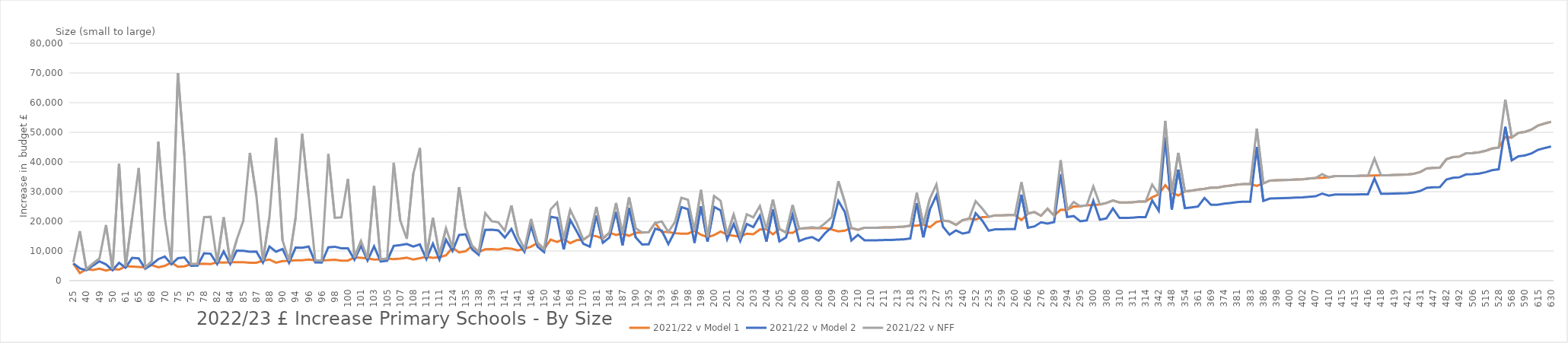
| Category | 2021/22 v Model 1 | 2021/22 v Model 2 | 2021/22 v NFF |
|---|---|---|---|
| 25.0 | 5811.593 | 5811.593 | 6213.718 |
| 36.0 | 2563.496 | 4150.422 | 16686.432 |
| 40.0 | 3883.133 | 3494.82 | 3883.133 |
| 45.0 | 3620.882 | 5048.206 | 5772.031 |
| 49.0 | 4023.598 | 6514.396 | 7490.063 |
| 49.0 | 3388.697 | 5486.462 | 18753.392 |
| 50.0 | 3915.221 | 3523.699 | 3915.221 |
| 58.0 | 3724.253 | 6029.742 | 39380.049 |
| 61.0 | 4846.749 | 4362.074 | 4846.749 |
| 61.0 | 4756.389 | 7700.821 | 21126.243 |
| 65.0 | 4639.358 | 7511.341 | 37982.715 |
| 65.0 | 4466.756 | 4020.081 | 4466.756 |
| 68.0 | 5244.518 | 5467.265 | 6561.045 |
| 69.0 | 4478.212 | 7250.439 | 46841.517 |
| 70.0 | 5007.302 | 8107.06 | 21109.706 |
| 73.0 | 6093.62 | 5484.258 | 6093.62 |
| 75.0 | 4688.474 | 7590.863 | 69994.969 |
| 75.0 | 4813.345 | 7793.035 | 41885.122 |
| 75.0 | 5576.842 | 5019.158 | 5576.842 |
| 77.0 | 5652.697 | 5087.428 | 5652.697 |
| 78.0 | 5689.828 | 9212.102 | 21407.631 |
| 78.0 | 5606.118 | 9076.572 | 21503.58 |
| 82.0 | 6177.833 | 5560.05 | 6177.833 |
| 83.0 | 6080.951 | 9845.349 | 21348.437 |
| 84.0 | 6224.773 | 5602.296 | 6224.773 |
| 85.0 | 6235.876 | 10096.18 | 13820.519 |
| 85.0 | 6215.303 | 10062.872 | 20174.98 |
| 86.0 | 6006.645 | 9725.044 | 43053.493 |
| 87.0 | 6055.256 | 9803.747 | 28607.131 |
| 88.0 | 6732.889 | 6059.6 | 6732.889 |
| 88.0 | 7116.099 | 11521.303 | 21495.438 |
| 89.0 | 6033.309 | 9768.214 | 48157.246 |
| 90.0 | 6593.15 | 10674.624 | 13577.74 |
| 91.0 | 6666.078 | 5999.47 | 6666.078 |
| 94.0 | 6881.127 | 11140.872 | 21239.34 |
| 95.0 | 6852.916 | 11095.197 | 49535.79 |
| 96.0 | 7091.543 | 11481.545 | 28535.888 |
| 96.0 | 6853.133 | 6167.82 | 6853.133 |
| 96.0 | 6763.827 | 6087.444 | 6763.827 |
| 97.0 | 6946.199 | 11246.228 | 42690.581 |
| 98.0 | 7061.706 | 11433.238 | 21165.446 |
| 99.0 | 6734.064 | 10902.77 | 21330.443 |
| 100.0 | 6748.935 | 10926.848 | 34267.461 |
| 101.0 | 7848.444 | 7063.6 | 7848.444 |
| 101.0 | 7705.874 | 11761.71 | 13386.295 |
| 101.0 | 7505.016 | 6754.514 | 7505.016 |
| 103.0 | 7129.254 | 11542.602 | 31922.029 |
| 103.0 | 7151.165 | 6436.048 | 7151.165 |
| 105.0 | 7430.61 | 6687.549 | 7430.61 |
| 107.0 | 7225.637 | 11698.65 | 39723.529 |
| 107.0 | 7412.376 | 12000.99 | 20306.678 |
| 107.0 | 7719.369 | 12365.928 | 14087.023 |
| 108.0 | 7094.892 | 11486.969 | 36040.874 |
| 110.0 | 7544.923 | 12215.59 | 44704.034 |
| 111.0 | 8027.103 | 7224.393 | 8027.103 |
| 111.0 | 7703.579 | 12472.462 | 21134.797 |
| 111.0 | 7873.156 | 7085.84 | 8713.02 |
| 115.0 | 8524.58 | 13801.702 | 17672.373 |
| 124.0 | 11113.98 | 10002.582 | 11113.98 |
| 130.0 | 9512.525 | 15401.231 | 31520.524 |
| 134.5 | 9916.799 | 15637.263 | 17800.695 |
| 135.3 | 11717.147 | 10545.432 | 11717.147 |
| 138.0 | 9641.747 | 8677.572 | 9641.747 |
| 138.0 | 10578.17 | 17126.56 | 22771.206 |
| 139.0 | 10626.788 | 17205.277 | 20062.218 |
| 140.0 | 10455.004 | 16927.15 | 19673.825 |
| 141.0 | 10977.25 | 14533.351 | 16801.336 |
| 141.0 | 10762.807 | 17425.497 | 25367.623 |
| 141.0 | 10185.304 | 12800.045 | 15068.03 |
| 143.0 | 10742.416 | 9668.175 | 10742.416 |
| 146.0 | 11453.08 | 18455.465 | 20803.875 |
| 150.0 | 12731.525 | 11458.372 | 12731.525 |
| 150.0 | 10677.802 | 9610.022 | 10677.802 |
| 155.0 | 13826.415 | 21523.395 | 24016.57 |
| 164.0 | 13051.284 | 21130.65 | 26363.798 |
| 165.0 | 14025 | 10506.375 | 14025 |
| 168.0 | 12643.461 | 20470.366 | 23856.544 |
| 169.0 | 13678.224 | 16586.038 | 19304.403 |
| 170.0 | 13806.736 | 12426.062 | 13806.736 |
| 180.0 | 15300 | 11461.5 | 15300 |
| 181.0 | 14974.215 | 21977.866 | 24889.251 |
| 181.0 | 14189.043 | 12770.138 | 14189.043 |
| 184.0 | 16185.145 | 14566.63 | 16185.145 |
| 186.0 | 15404.29 | 23197.368 | 26189.178 |
| 187.0 | 15895 | 11907.225 | 15895 |
| 188.0 | 15122.984 | 24484.831 | 28065.662 |
| 190.0 | 16150 | 14608.301 | 17664.451 |
| 191.0 | 16235 | 12187.44 | 16235 |
| 192.0 | 16320 | 12262.68 | 16320 |
| 193.0 | 19465.74 | 17519.166 | 19465.74 |
| 193.0 | 16405 | 16844.956 | 19949.361 |
| 193.0 | 16405 | 12337.92 | 16405 |
| 196.0 | 15994.136 | 16561.352 | 19714.012 |
| 197.0 | 15839.975 | 24769.002 | 27937.747 |
| 198.0 | 15844.828 | 24091.796 | 27276.626 |
| 198.0 | 16830 | 12714.12 | 16830 |
| 198.0 | 15464.845 | 25038.32 | 30591.178 |
| 199.0 | 14627.743 | 13164.969 | 14627.743 |
| 200.0 | 15357.941 | 24865.237 | 28518.607 |
| 200.0 | 16562.442 | 23674.977 | 26891.977 |
| 201.0 | 15478.653 | 13930.787 | 15478.653 |
| 201.0 | 15144.56 | 19102.872 | 22335.957 |
| 202.0 | 14834.428 | 13350.986 | 14834.428 |
| 203.0 | 15853.863 | 19114.459 | 22379.714 |
| 203.0 | 15623.585 | 18048.929 | 21314.184 |
| 203.0 | 17255 | 21902.48 | 25167.735 |
| 204.0 | 17340 | 13165.56 | 17340 |
| 205.0 | 15612.382 | 23978.056 | 27275.481 |
| 205.0 | 17425 | 13240.8 | 17425 |
| 206.0 | 16198.087 | 14578.278 | 16198.087 |
| 206.0 | 16114.444 | 22203.825 | 25517.335 |
| 206.0 | 17510 | 13316.04 | 17510 |
| 208.0 | 17680 | 14197.308 | 17680 |
| 208.0 | 17680 | 14680.059 | 18025.739 |
| 208.0 | 17680 | 13466.52 | 17680 |
| 208.0 | 17680 | 16051.107 | 19396.787 |
| 209.0 | 17224.941 | 18032.855 | 21394.62 |
| 209.0 | 16613.244 | 26897.634 | 33541.558 |
| 209.0 | 16841.682 | 23122.723 | 26484.488 |
| 209.0 | 17765 | 13541.76 | 17765 |
| 210.0 | 17151.816 | 15436.634 | 17151.816 |
| 210.0 | 17850 | 13617 | 17850 |
| 210.0 | 17850 | 13617 | 17850 |
| 210.0 | 17850 | 13617 | 17850 |
| 211.0 | 17935 | 13692.24 | 17935 |
| 211.0 | 17935 | 13692.24 | 17935 |
| 213.0 | 18105 | 13842.72 | 18105 |
| 214.0 | 18190 | 13917.96 | 18190 |
| 218.0 | 18530 | 14218.92 | 18530 |
| 220.0 | 18524 | 26129.398 | 29668.098 |
| 223.0 | 18955 | 14595.12 | 18955 |
| 224.0 | 17983.828 | 24012.154 | 27615.194 |
| 227.0 | 19799.442 | 28770.221 | 32421.516 |
| 232.0 | 20239.709 | 18215.738 | 20239.709 |
| 235.0 | 19975 | 15498 | 19975 |
| 240.0 | 18815.958 | 16934.362 | 18815.958 |
| 240.0 | 20400 | 15874.2 | 20400 |
| 246.0 | 20910 | 16325.64 | 20910 |
| 252.0 | 20585.986 | 22738.921 | 26792.341 |
| 252.0 | 21420 | 20284.506 | 24337.926 |
| 253.0 | 21505 | 16852.32 | 21505 |
| 259.0 | 22015 | 17303.76 | 22015 |
| 259.0 | 22015 | 17303.76 | 22015 |
| 260.0 | 22100 | 17379 | 22100 |
| 260.0 | 22100 | 17379 | 22100 |
| 261.0 | 20459.92 | 28992.218 | 33190.403 |
| 266.0 | 22610 | 17830.44 | 22610 |
| 272.0 | 23120 | 18281.88 | 23120 |
| 276.0 | 21869.78 | 19682.802 | 21869.78 |
| 285.0 | 24225 | 19260 | 24225 |
| 289.0 | 21936.747 | 19743.073 | 21936.747 |
| 292.0 | 23879.974 | 35909.091 | 40605.911 |
| 294.0 | 23836.105 | 21452.494 | 23836.105 |
| 294.0 | 24990 | 21783.588 | 26512.578 |
| 295.0 | 25075 | 20012.4 | 25075 |
| 299.0 | 25415 | 20313.36 | 25415 |
| 300.0 | 25500 | 26936.25 | 31761.75 |
| 302.0 | 25670 | 20539.08 | 25670 |
| 308.0 | 26180 | 20990.52 | 26180 |
| 310.0 | 27037.914 | 24334.122 | 27037.914 |
| 310.0 | 26350 | 21141 | 26350 |
| 310.0 | 26350 | 21141 | 26350 |
| 311.0 | 26435 | 21216.24 | 26435 |
| 314.0 | 26690 | 21441.96 | 26690 |
| 314.0 | 26690 | 21441.96 | 26690 |
| 331.0 | 28135 | 27052.569 | 32376.704 |
| 342.0 | 29070 | 23548.68 | 29070 |
| 347.0 | 32204.95 | 48276.654 | 53858.149 |
| 348.0 | 29580 | 24000.12 | 29580 |
| 353.0 | 28720.018 | 37405.75 | 43083.755 |
| 354.0 | 30090 | 24451.56 | 30090 |
| 357.0 | 30345 | 24677.28 | 30345 |
| 361.0 | 30685 | 24978.24 | 30685 |
| 364.0 | 30959.407 | 27863.466 | 30959.407 |
| 369.0 | 31365 | 25580.16 | 31365 |
| 369.0 | 31365 | 25580.16 | 31365 |
| 374.0 | 31790 | 25956.36 | 31790 |
| 377.0 | 32045 | 26182.08 | 32045 |
| 381.0 | 32385 | 26483.04 | 32385 |
| 383.0 | 32555 | 26633.52 | 32555 |
| 383.0 | 32555 | 26633.52 | 32555 |
| 386.0 | 31920.497 | 45052.408 | 51261.218 |
| 386.0 | 32810 | 26859.24 | 32810 |
| 397.0 | 33745 | 27686.88 | 33745 |
| 398.0 | 33830 | 27762.12 | 33830 |
| 399.0 | 33915 | 27837.36 | 33915 |
| 400.0 | 34000 | 27912.6 | 34000 |
| 401.0 | 34085 | 27987.84 | 34085 |
| 402.0 | 34170 | 28063.08 | 34170 |
| 405.0 | 34425 | 28288.8 | 34425 |
| 407.0 | 34595 | 28439.28 | 34595 |
| 408.0 | 34680 | 29364.885 | 35927.565 |
| 410.0 | 34850 | 28665 | 34850 |
| 415.0 | 35275 | 29041.2 | 35275 |
| 415.0 | 35275 | 29041.2 | 35275 |
| 415.0 | 35275 | 29041.2 | 35275 |
| 415.0 | 35275 | 29041.2 | 35275 |
| 416.0 | 35360 | 29116.44 | 35360 |
| 416.0 | 35360 | 29116.44 | 35360 |
| 417.0 | 35445 | 34451.539 | 41158.984 |
| 418.0 | 35530 | 29266.92 | 35530 |
| 418.0 | 35530 | 29266.92 | 35530 |
| 419.0 | 35615 | 29342.16 | 35615 |
| 420.0 | 35700 | 29417.4 | 35700 |
| 421.0 | 35785 | 29492.64 | 35785 |
| 424.0 | 36040 | 29718.36 | 36040 |
| 431.0 | 36635 | 30245.04 | 36635 |
| 445.0 | 37825 | 31298.4 | 37825 |
| 447.0 | 37995 | 31448.88 | 37995 |
| 448.0 | 38080 | 31524.12 | 38080 |
| 482.0 | 40970 | 34082.28 | 40970 |
| 490.0 | 41650 | 34684.2 | 41650 |
| 492.0 | 41820 | 34834.68 | 41820 |
| 505.0 | 42925 | 35812.8 | 42925 |
| 506.0 | 43010 | 35888.04 | 43010 |
| 509.0 | 43265 | 36113.76 | 43265 |
| 515.0 | 43775 | 36565.2 | 43775 |
| 524.0 | 44540 | 37242.36 | 44540 |
| 528.0 | 44880 | 37543.32 | 44880 |
| 568.0 | 48342.612 | 51882.53 | 61018.81 |
| 568.0 | 48280 | 40552.92 | 48280 |
| 586.0 | 49810 | 41907.24 | 49810 |
| 590.0 | 50150 | 42208.2 | 50150 |
| 599.0 | 50915 | 42885.36 | 50915 |
| 615.0 | 52275 | 44089.2 | 52275 |
| 623.0 | 52955 | 44691.12 | 52955 |
| 630.0 | 53550 | 45217.8 | 53550 |